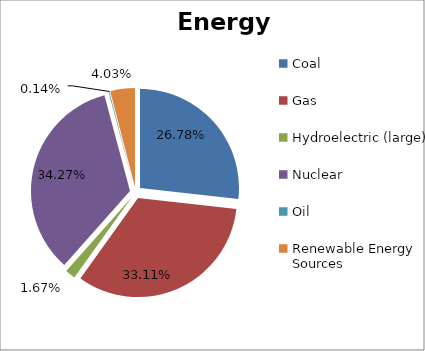
| Category | Energy Source |
|---|---|
| Coal | 0.268 |
| Gas | 0.331 |
| Hydroelectric (large) | 0.017 |
| Nuclear | 0.343 |
| Oil | 0.001 |
| Renewable Energy Sources | 0.04 |